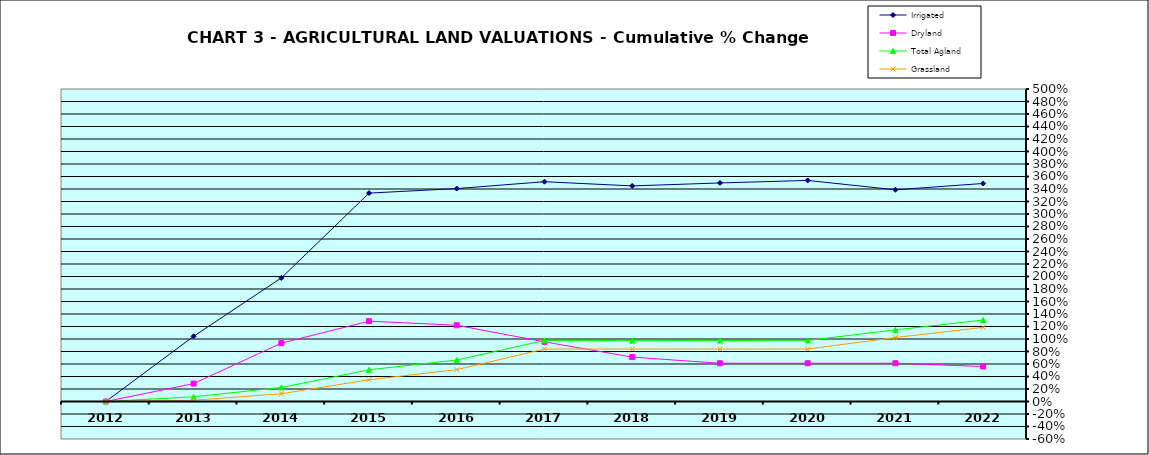
| Category | Irrigated | Dryland | Total Agland | Grassland |
|---|---|---|---|---|
| 2012.0 | 0 | 0 | 0 | 0 |
| 2013.0 | 1.043 | 0.287 | 0.075 | 0.021 |
| 2014.0 | 1.977 | 0.933 | 0.224 | 0.123 |
| 2015.0 | 3.334 | 1.286 | 0.507 | 0.348 |
| 2016.0 | 3.407 | 1.22 | 0.664 | 0.51 |
| 2017.0 | 3.517 | 0.954 | 0.977 | 0.839 |
| 2018.0 | 3.449 | 0.71 | 0.974 | 0.84 |
| 2019.0 | 3.497 | 0.612 | 0.976 | 0.84 |
| 2020.0 | 3.537 | 0.612 | 0.978 | 0.84 |
| 2021.0 | 3.387 | 0.612 | 1.146 | 1.024 |
| 2022.0 | 3.488 | 0.56 | 1.303 | 1.186 |